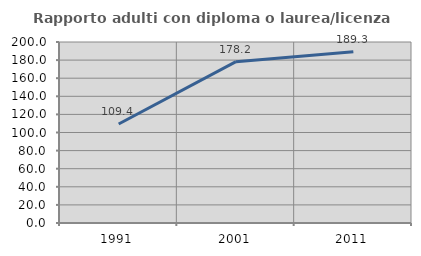
| Category | Rapporto adulti con diploma o laurea/licenza media  |
|---|---|
| 1991.0 | 109.39 |
| 2001.0 | 178.235 |
| 2011.0 | 189.308 |